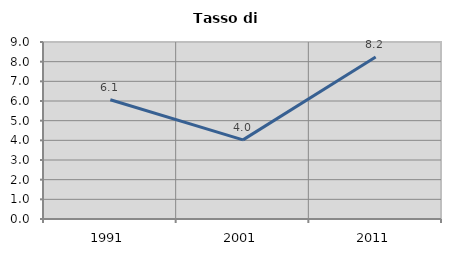
| Category | Tasso di disoccupazione   |
|---|---|
| 1991.0 | 6.064 |
| 2001.0 | 4.023 |
| 2011.0 | 8.235 |